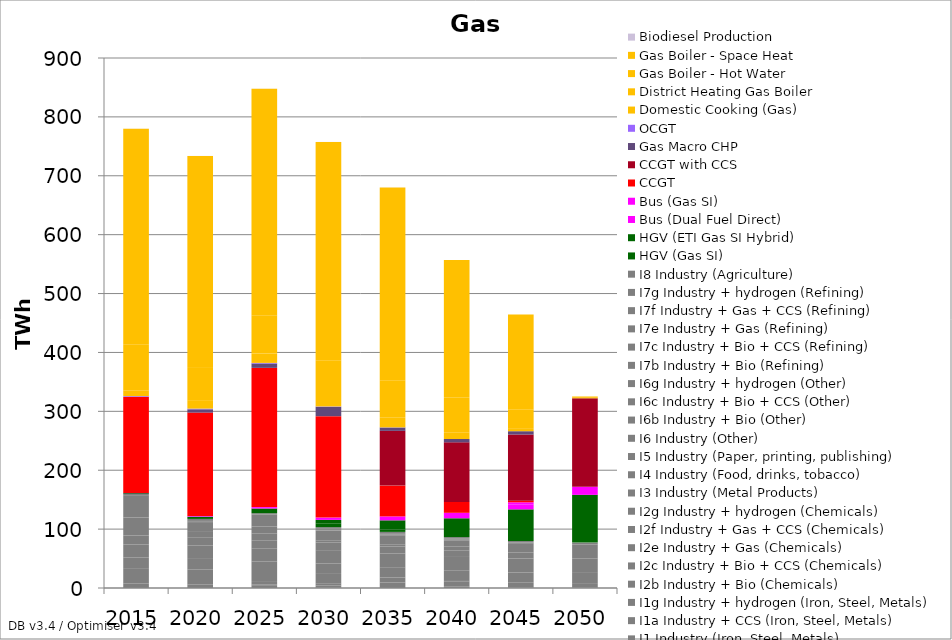
| Category | I1 Industry (Iron, Steel, Metals) | I1a Industry + CCS (Iron, Steel, Metals) | I1g Industry + hydrogen (Iron, Steel, Metals) | I2b Industry + Bio (Chemicals) | I2c Industry + Bio + CCS (Chemicals) | I2e Industry + Gas (Chemicals) | I2f Industry + Gas + CCS (Chemicals) | I2g Industry + hydrogen (Chemicals) | I3 Industry (Metal Products) | I4 Industry (Food, drinks, tobacco) | I5 Industry (Paper, printing, publishing) | I6 Industry (Other) | I6b Industry + Bio (Other) | I6c Industry + Bio + CCS (Other) | I6g Industry + hydrogen (Other) | I7b Industry + Bio (Refining) | I7c Industry + Bio + CCS (Refining) | I7e Industry + Gas (Refining) | I7f Industry + Gas + CCS (Refining) | I7g Industry + hydrogen (Refining) | I8 Industry (Agriculture) | HGV (Gas SI) | HGV (ETI Gas SI Hybrid) | Bus (Dual Fuel Direct) | Bus (Gas SI) | CCGT | CCGT with CCS | Gas Macro CHP | OCGT | Domestic Cooking (Gas) | District Heating Gas Boiler | Gas Boiler - Hot Water | Gas Boiler - Space Heat | Biodiesel Production |
|---|---|---|---|---|---|---|---|---|---|---|---|---|---|---|---|---|---|---|---|---|---|---|---|---|---|---|---|---|---|---|---|---|---|---|
| 2015.0 | 7.905 | 0 | 0 | 0 | 0 | 25.844 | 0 | 0 | 17.831 | 22.424 | 15.048 | 30.814 | 0 | 0 | 0 | 0.505 | 0 | 37.296 | 0 | 0 | 1.954 | 1.436 | 0 | 0 | 0.421 | 162.965 | 0 | 0 | 1.366 | 9.718 | 0.001 | 78.464 | 365.81 | 0.106 |
| 2020.0 | 5.7 | 0 | 0 | 0 | 0 | 25.953 | 0 | 0 | 17.727 | 22.554 | 14.305 | 10.432 | 13.879 | 0 | 0 | 1.919 | 0 | 2.857 | 0 | 0 | 2.015 | 3.866 | 0 | 0 | 1.133 | 175.534 | 0 | 5.603 | 1.15 | 13.151 | 0.001 | 57.403 | 358.438 | 0.106 |
| 2025.0 | 4.743 | 0 | 0 | 0.743 | 1.143 | 3.66 | 16.897 | 0 | 17.594 | 22.687 | 13.57 | 11.196 | 12.336 | 0 | 0 | 0.723 | 0 | 19.669 | 0 | 0 | 2.079 | 7.972 | 0 | 0 | 2.337 | 236.442 | 0 | 7.432 | 1.011 | 15.904 | 0.001 | 64.062 | 385.777 | 0.106 |
| 2030.0 | 0.583 | 3.429 | 0 | 0 | 3.116 | 0 | 16.809 | 0 | 17.489 | 22.869 | 12.816 | 3.124 | 17.116 | 0 | 0 | 0.419 | 1.095 | 0 | 2.334 | 0 | 2.151 | 6.536 | 5.781 | 0 | 3.947 | 172.166 | 0 | 15.896 | 0.62 | 16.033 | 0.021 | 61.413 | 371.74 | 0.103 |
| 2035.0 | 0 | 3.407 | 0 | 0 | 5.886 | 0 | 8.634 | 0 | 17.414 | 23.104 | 12.042 | 2.989 | 16.073 | 0 | 0 | 0 | 1.364 | 0 | 2.137 | 0 | 2.233 | 4.106 | 15.535 | 0 | 6.653 | 52.31 | 92.97 | 5.654 | 0.27 | 16.129 | 0.07 | 63.736 | 327.526 | 0.106 |
| 2040.0 | 0 | 2.887 | 0 | 0 | 8.521 | 0 | 0.552 | 0 | 17.366 | 23.4 | 11.246 | 0 | 0 | 6.208 | 10.77 | 0 | 1.233 | 0 | 1.945 | 0 | 2.327 | 0 | 31.958 | 3.828 | 5.449 | 18.532 | 101.173 | 5.654 | 0.015 | 10.34 | 0.256 | 59.209 | 234.301 | 0 |
| 2045.0 | 0 | 0 | 0.728 | 0 | 0 | 0 | 0 | 8.283 | 17.345 | 23.764 | 10.428 | 0 | 0 | 0.357 | 15.215 | 0 | 1.117 | 0 | 0 | 0.1 | 2.434 | 0 | 53.772 | 8.582 | 3.418 | 2.744 | 112.32 | 5.651 | 0.015 | 5.169 | 0.282 | 30.934 | 161.957 | 0 |
| 2050.0 | 0 | 0 | 0.607 | 0 | 0 | 0 | 0 | 7.678 | 17.347 | 24.204 | 9.587 | 0 | 0 | 0 | 13.973 | 0 | 0 | 0 | 0 | 1.103 | 2.555 | 0 | 81.15 | 13.66 | 0 | 0 | 150.261 | 0 | 0.015 | 0 | 0.524 | 0.254 | 2.309 | 0 |